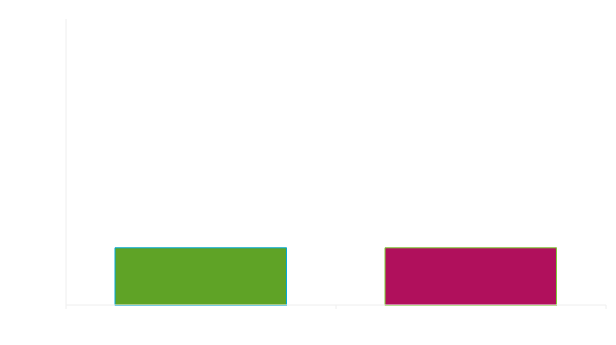
| Category | Series 0 |
|---|---|
| 0 | 100 |
| 1 | 100 |